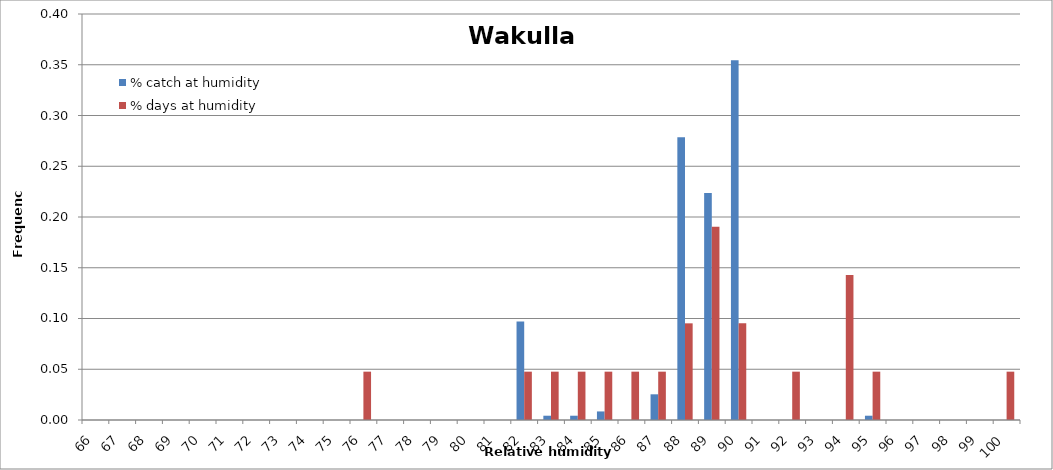
| Category | % catch at humidity | % days at humidity |
|---|---|---|
| 66.0 | 0 | 0 |
| 67.0 | 0 | 0 |
| 68.0 | 0 | 0 |
| 69.0 | 0 | 0 |
| 70.0 | 0 | 0 |
| 71.0 | 0 | 0 |
| 72.0 | 0 | 0 |
| 73.0 | 0 | 0 |
| 74.0 | 0 | 0 |
| 75.0 | 0 | 0 |
| 76.0 | 0 | 0.048 |
| 77.0 | 0 | 0 |
| 78.0 | 0 | 0 |
| 79.0 | 0 | 0 |
| 80.0 | 0 | 0 |
| 81.0 | 0 | 0 |
| 82.0 | 0.097 | 0.048 |
| 83.0 | 0.004 | 0.048 |
| 84.0 | 0.004 | 0.048 |
| 85.0 | 0.008 | 0.048 |
| 86.0 | 0 | 0.048 |
| 87.0 | 0.025 | 0.048 |
| 88.0 | 0.278 | 0.095 |
| 89.0 | 0.224 | 0.19 |
| 90.0 | 0.354 | 0.095 |
| 91.0 | 0 | 0 |
| 92.0 | 0 | 0.048 |
| 93.0 | 0 | 0 |
| 94.0 | 0 | 0.143 |
| 95.0 | 0.004 | 0.048 |
| 96.0 | 0 | 0 |
| 97.0 | 0 | 0 |
| 98.0 | 0 | 0 |
| 99.0 | 0 | 0 |
| 100.0 | 0 | 0.048 |